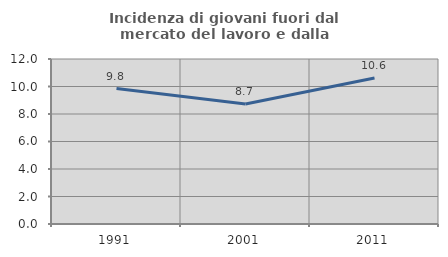
| Category | Incidenza di giovani fuori dal mercato del lavoro e dalla formazione  |
|---|---|
| 1991.0 | 9.849 |
| 2001.0 | 8.732 |
| 2011.0 | 10.614 |